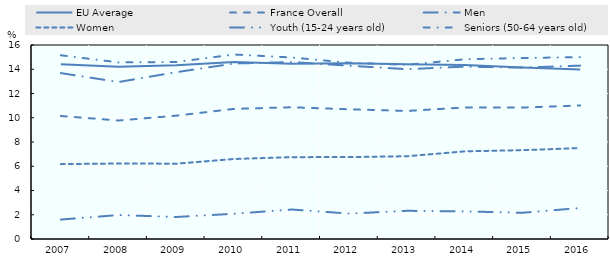
| Category | EU Average | France Overall | Men | Women | Youth (15-24 years old) | Seniors (50-64 years old) |
|---|---|---|---|---|---|---|
| 2007.0 | 14.419 | 10.145 | 13.681 | 6.174 | 1.603 | 15.153 |
| 2008.0 | 14.216 | 9.774 | 12.948 | 6.227 | 1.978 | 14.566 |
| 2009.0 | 14.333 | 10.172 | 13.758 | 6.211 | 1.816 | 14.598 |
| 2010.0 | 14.595 | 10.731 | 14.473 | 6.597 | 2.082 | 15.216 |
| 2011.0 | 14.446 | 10.865 | 14.592 | 6.749 | 2.431 | 14.971 |
| 2012.0 | 14.502 | 10.697 | 14.291 | 6.759 | 2.096 | 14.535 |
| 2013.0 | 14.418 | 10.562 | 14.004 | 6.825 | 2.324 | 14.365 |
| 2014.0 | 14.354 | 10.846 | 14.217 | 7.228 | 2.278 | 14.824 |
| 2015.0 | 14.148 | 10.84 | 14.134 | 7.328 | 2.164 | 14.929 |
| 2016.0 | 13.986 | 11.014 | 14.3 | 7.499 | 2.556 | 14.999 |